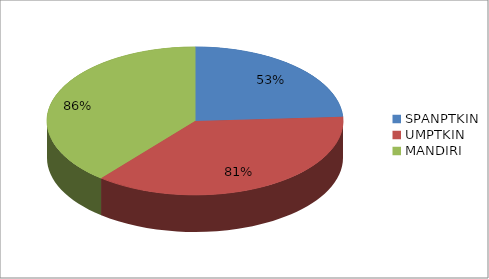
| Category | Series 0 |
|---|---|
| SPANPTKIN | 0.53 |
| UMPTKIN | 0.81 |
| MANDIRI | 0.86 |